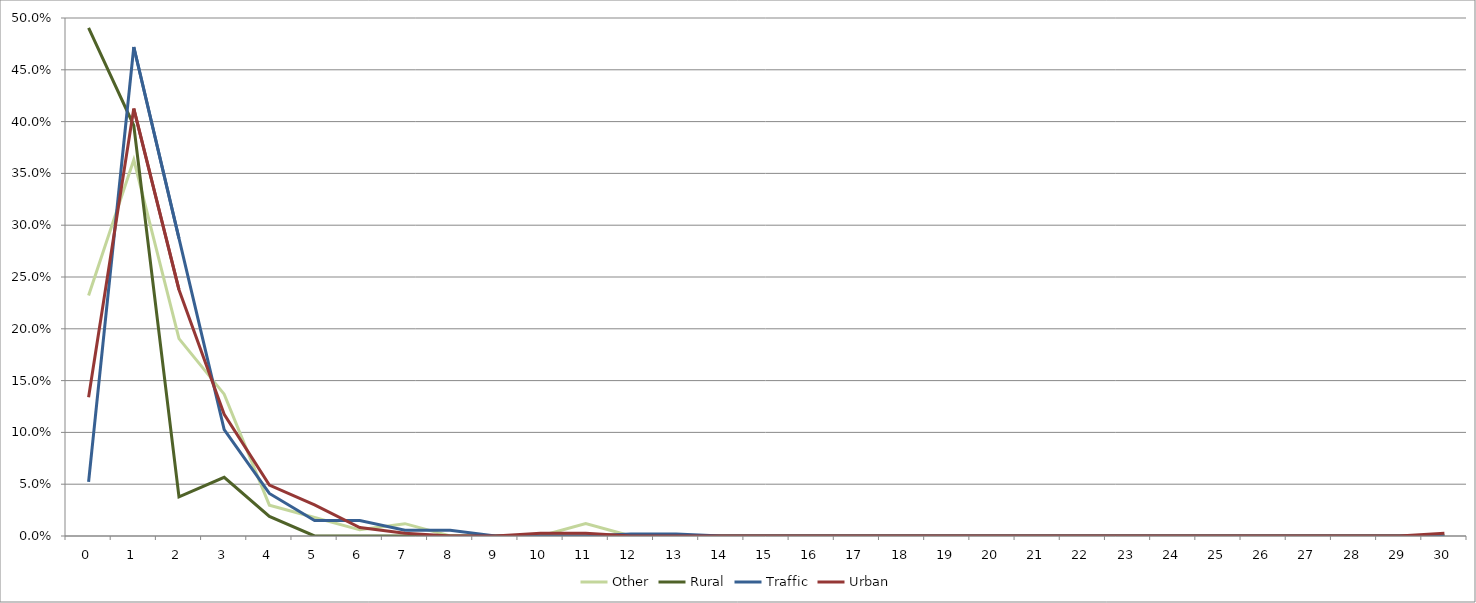
| Category | Other | Rural | Traffic | Urban |
|---|---|---|---|---|
| 0.0 | 0.232 | 0.491 | 0.052 | 0.134 |
| 1.0 | 0.363 | 0.396 | 0.472 | 0.413 |
| 2.0 | 0.19 | 0.038 | 0.287 | 0.238 |
| 3.0 | 0.137 | 0.057 | 0.103 | 0.117 |
| 4.0 | 0.03 | 0.019 | 0.041 | 0.049 |
| 5.0 | 0.018 | 0 | 0.015 | 0.03 |
| 6.0 | 0.006 | 0 | 0.015 | 0.008 |
| 7.0 | 0.012 | 0 | 0.006 | 0.003 |
| 8.0 | 0 | 0 | 0.006 | 0 |
| 9.0 | 0 | 0 | 0 | 0 |
| 10.0 | 0 | 0 | 0 | 0.003 |
| 11.0 | 0.012 | 0 | 0 | 0.003 |
| 12.0 | 0 | 0 | 0.002 | 0 |
| 13.0 | 0 | 0 | 0.002 | 0 |
| 14.0 | 0 | 0 | 0 | 0 |
| 15.0 | 0 | 0 | 0 | 0 |
| 16.0 | 0 | 0 | 0 | 0 |
| 17.0 | 0 | 0 | 0 | 0 |
| 18.0 | 0 | 0 | 0 | 0 |
| 19.0 | 0 | 0 | 0 | 0 |
| 20.0 | 0 | 0 | 0 | 0 |
| 21.0 | 0 | 0 | 0 | 0 |
| 22.0 | 0 | 0 | 0 | 0 |
| 23.0 | 0 | 0 | 0 | 0 |
| 24.0 | 0 | 0 | 0 | 0 |
| 25.0 | 0 | 0 | 0 | 0 |
| 26.0 | 0 | 0 | 0 | 0 |
| 27.0 | 0 | 0 | 0 | 0 |
| 28.0 | 0 | 0 | 0 | 0 |
| 29.0 | 0 | 0 | 0 | 0 |
| 30.0 | 0 | 0 | 0 | 0.003 |